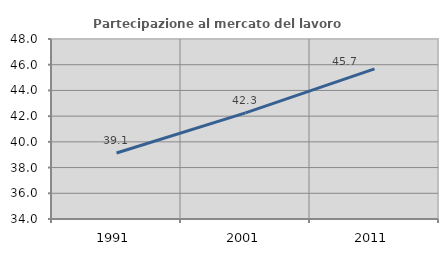
| Category | Partecipazione al mercato del lavoro  femminile |
|---|---|
| 1991.0 | 39.132 |
| 2001.0 | 42.259 |
| 2011.0 | 45.675 |